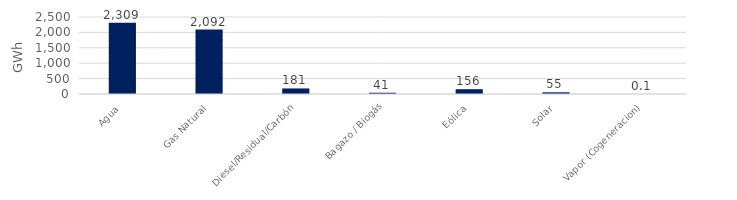
| Category | Series 0 |
|---|---|
| Agua | 2309.401 |
| Gas Natural | 2091.831 |
| Diesel/Residual/Carbón | 180.52 |
| Bagazo / Biogás | 40.92 |
| Eólica | 155.893 |
| Solar | 55.024 |
| Vapor (Cogeneracion) | 0.117 |